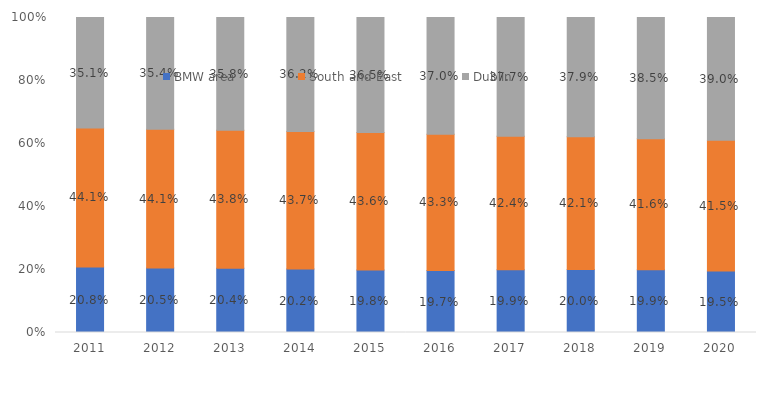
| Category | BMW area | South and East | Dublin |
|---|---|---|---|
| 2011.0 | 0.208 | 0.441 | 0.351 |
| 2012.0 | 0.205 | 0.441 | 0.354 |
| 2013.0 | 0.204 | 0.438 | 0.358 |
| 2014.0 | 0.202 | 0.437 | 0.362 |
| 2015.0 | 0.198 | 0.436 | 0.365 |
| 2016.0 | 0.197 | 0.433 | 0.37 |
| 2017.0 | 0.199 | 0.424 | 0.377 |
| 2018.0 | 0.2 | 0.421 | 0.379 |
| 2019.0 | 0.199 | 0.416 | 0.385 |
| 2020.0 | 0.195 | 0.415 | 0.39 |